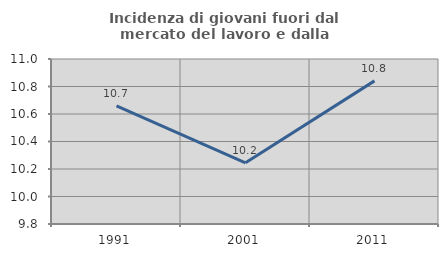
| Category | Incidenza di giovani fuori dal mercato del lavoro e dalla formazione  |
|---|---|
| 1991.0 | 10.66 |
| 2001.0 | 10.245 |
| 2011.0 | 10.841 |